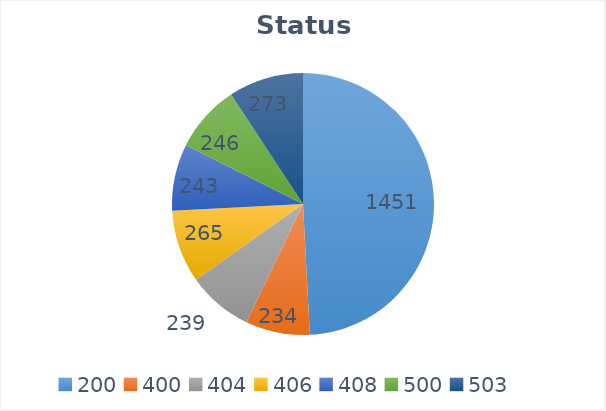
| Category | Code Count |
|---|---|
| 200.0 | 1451 |
| 400.0 | 234 |
| 404.0 | 239 |
| 406.0 | 265 |
| 408.0 | 243 |
| 500.0 | 246 |
| 503.0 | 273 |